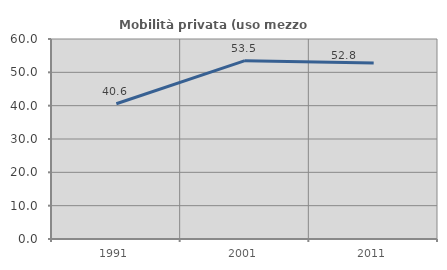
| Category | Mobilità privata (uso mezzo privato) |
|---|---|
| 1991.0 | 40.571 |
| 2001.0 | 53.499 |
| 2011.0 | 52.822 |